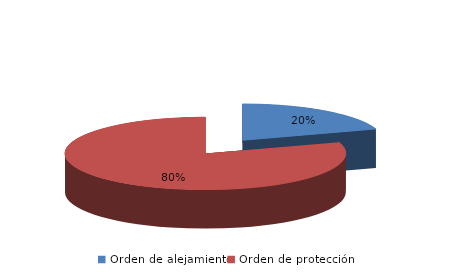
| Category | Series 0 |
|---|---|
| Orden de alejamiento | 113 |
| Orden de protección | 453 |